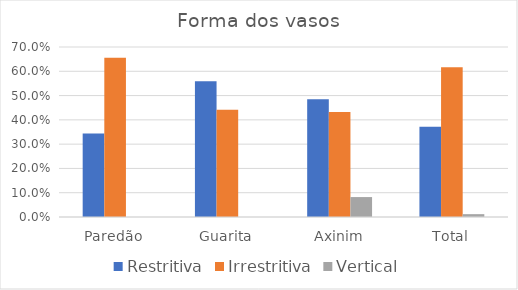
| Category | Restritiva | Irrestritiva | Vertical |
|---|---|---|---|
| Paredão | 0.344 | 0.656 | 0 |
| Guarita | 0.559 | 0.441 | 0 |
| Axinim | 0.485 | 0.433 | 0.082 |
| Total | 0.372 | 0.616 | 0.012 |